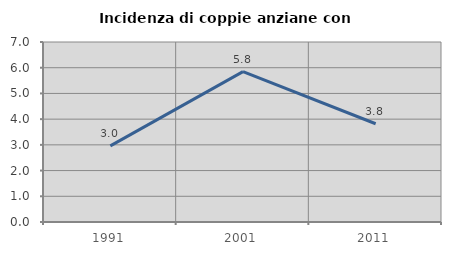
| Category | Incidenza di coppie anziane con figli |
|---|---|
| 1991.0 | 2.959 |
| 2001.0 | 5.848 |
| 2011.0 | 3.822 |